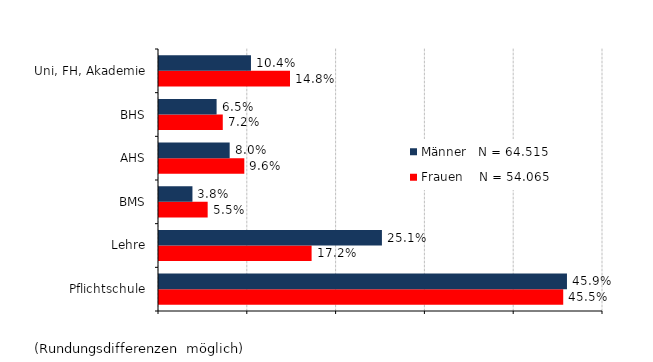
| Category | Frauen    N = 54.065 | Männer   N = 64.515 |
|---|---|---|
| Pflichtschule | 0.455 | 0.459 |
| Lehre | 0.172 | 0.251 |
| BMS | 0.055 | 0.038 |
| AHS | 0.096 | 0.08 |
| BHS | 0.072 | 0.065 |
| Uni, FH, Akademie | 0.148 | 0.104 |